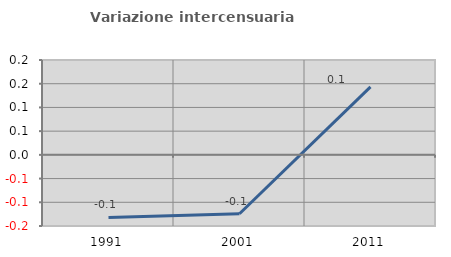
| Category | Variazione intercensuaria annua |
|---|---|
| 1991.0 | -0.132 |
| 2001.0 | -0.124 |
| 2011.0 | 0.143 |